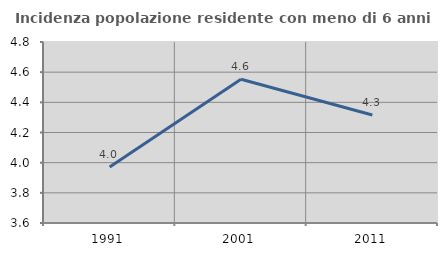
| Category | Incidenza popolazione residente con meno di 6 anni |
|---|---|
| 1991.0 | 3.972 |
| 2001.0 | 4.553 |
| 2011.0 | 4.316 |